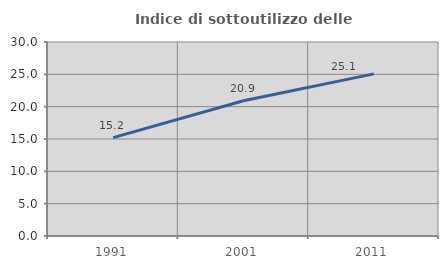
| Category | Indice di sottoutilizzo delle abitazioni  |
|---|---|
| 1991.0 | 15.217 |
| 2001.0 | 20.921 |
| 2011.0 | 25.068 |